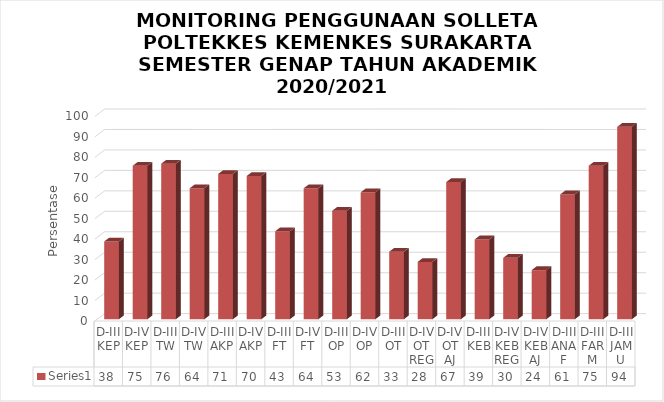
| Category | Series 0 |
|---|---|
| D-III KEP | 38 |
| D-IV KEP | 75 |
| D-III TW | 76 |
| D-IV TW | 64 |
| D-III AKP | 71 |
| D-IV AKP | 70 |
| D-III FT | 43 |
| D-IV FT | 64 |
| D-III OP | 53 |
| D-IV OP | 62 |
| D-III OT | 33 |
| D-IV OT REG | 28 |
| D-IV OT AJ | 67 |
| D-III KEB | 39 |
| D-IV KEB REG | 30 |
| D-IV KEB AJ | 24 |
| D-III ANAF | 61 |
| D-III FARM | 75 |
| D-III JAMU | 94 |